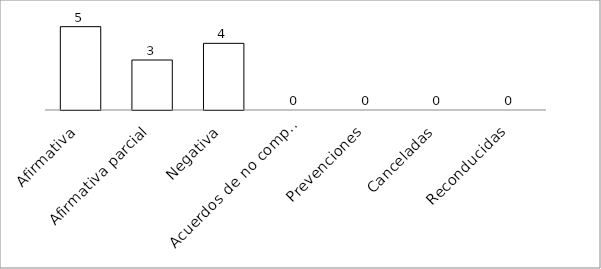
| Category | Series 0 |
|---|---|
| Afirmativa | 5 |
| Afirmativa parcial | 3 |
| Negativa | 4 |
| Acuerdos de no competencia | 0 |
| Prevenciones | 0 |
| Canceladas | 0 |
| Reconducidas | 0 |